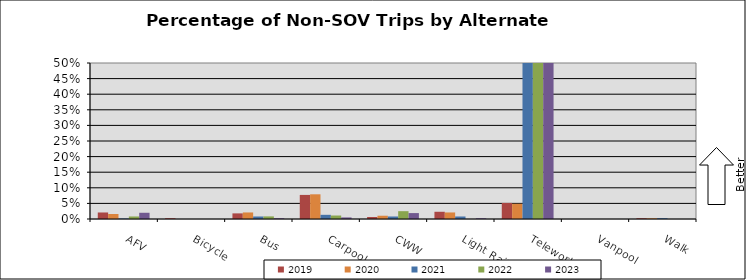
| Category | 2019 | 2020 | 2021 | 2022 | 2023 |
|---|---|---|---|---|---|
| AFV | 0.021 | 0.016 | 0.002 | 0.008 | 0.02 |
| Bicycle | 0.003 | 0 | 0 | 0 | 0 |
| Bus | 0.018 | 0.021 | 0.008 | 0.008 | 0.003 |
| Carpool | 0.077 | 0.079 | 0.013 | 0.011 | 0.005 |
| CWW | 0.006 | 0.01 | 0.008 | 0.025 | 0.019 |
| Light Rail | 0.023 | 0.021 | 0.008 | 0 | 0.003 |
| Telework | 0.051 | 0.049 | 0.657 | 0.507 | 0.612 |
| Vanpool | 0 | 0 | 0 | 0 | 0 |
| Walk | 0.003 | 0.002 | 0.003 | 0 | 0 |